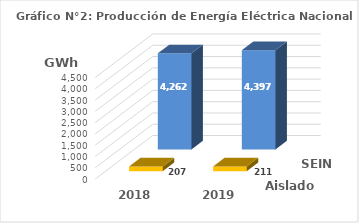
| Category | Aislados | SEIN |
|---|---|---|
| 2018.0 | 207.335 | 4261.975 |
| 2019.0 | 210.62 | 4396.986 |